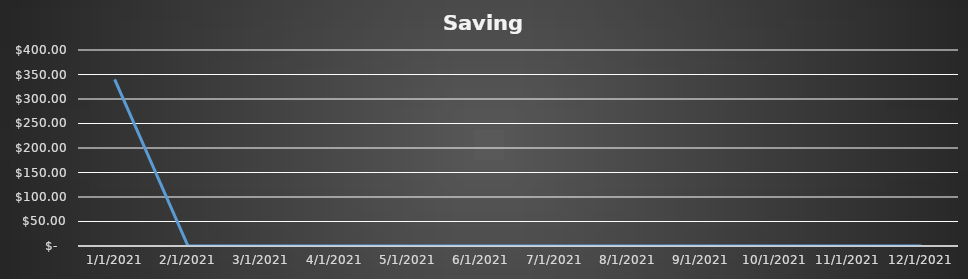
| Category | Savings |
|---|---|
| 1/31/21 | 340 |
| 2/28/21 | 0 |
| 3/31/21 | 0 |
| 4/30/21 | 0 |
| 5/31/21 | 0 |
| 6/30/21 | 0 |
| 7/31/21 | 0 |
| 8/31/21 | 0 |
| 9/30/21 | 0 |
| 10/31/21 | 0 |
| 11/30/21 | 0 |
| 12/31/21 | 0 |